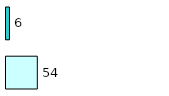
| Category | Series 0 | Series 1 |
|---|---|---|
| 0 | 54 | 6 |